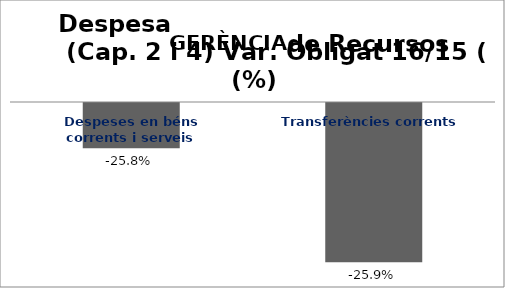
| Category | Series 0 |
|---|---|
| Despeses en béns corrents i serveis | -0.258 |
| Transferències corrents | -0.259 |